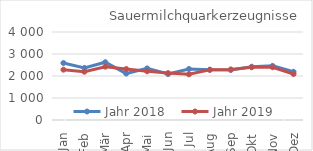
| Category | Jahr 2018 | Jahr 2019 |
|---|---|---|
| Jan | 2589.075 | 2288.105 |
| Feb | 2367.787 | 2193.391 |
| Mär | 2626.567 | 2424.089 |
| Apr | 2111.599 | 2315.987 |
| Mai | 2346.084 | 2214.289 |
| Jun | 2090.337 | 2131.383 |
| Jul | 2319.337 | 2076.007 |
| Aug | 2281.809 | 2283.001 |
| Sep | 2272.131 | 2299.382 |
| Okt | 2421.006 | 2397.085 |
| Nov | 2460.828 | 2398.913 |
| Dez | 2191.95 | 2091.059 |